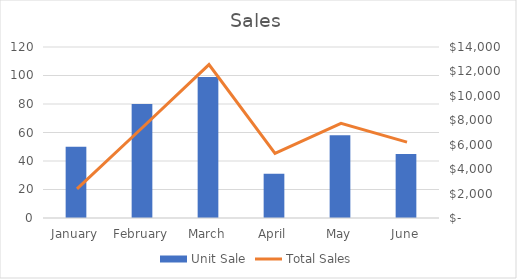
| Category | Unit Sale |
|---|---|
| January | 50 |
| February | 80 |
| March | 99 |
| April | 31 |
| May | 58 |
| June | 45 |